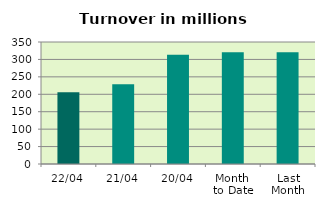
| Category | Series 0 |
|---|---|
| 22/04 | 205.888 |
| 21/04 | 228.875 |
| 20/04 | 313.427 |
| Month 
to Date | 320.807 |
| Last
Month | 320.663 |